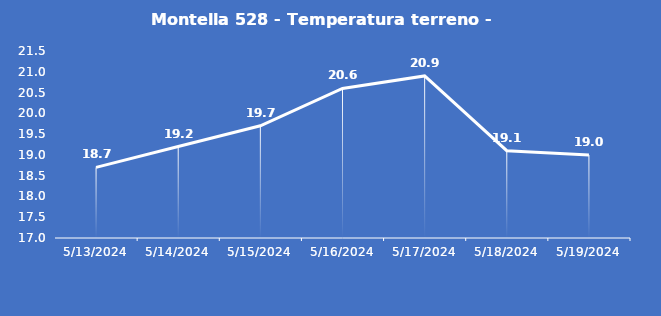
| Category | Montella 528 - Temperatura terreno - Grezzo (°C) |
|---|---|
| 5/13/24 | 18.7 |
| 5/14/24 | 19.2 |
| 5/15/24 | 19.7 |
| 5/16/24 | 20.6 |
| 5/17/24 | 20.9 |
| 5/18/24 | 19.1 |
| 5/19/24 | 19 |